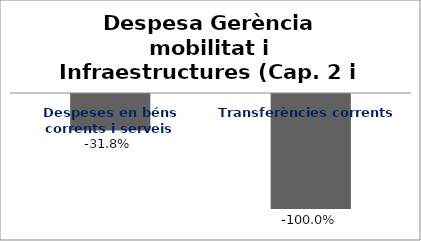
| Category | Series 0 |
|---|---|
| Despeses en béns corrents i serveis | -0.318 |
| Transferències corrents | -1 |